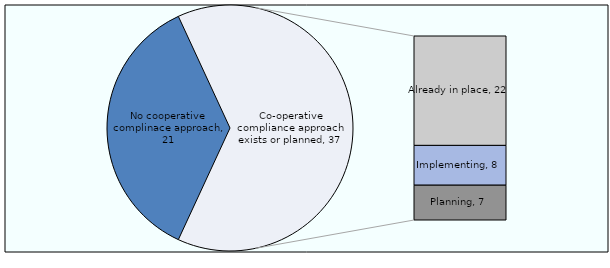
| Category | Series 0 |
|---|---|
| No cooperative complinace approach | 21 |
| Already in place | 22 |
| Implementing | 8 |
| Planning | 7 |